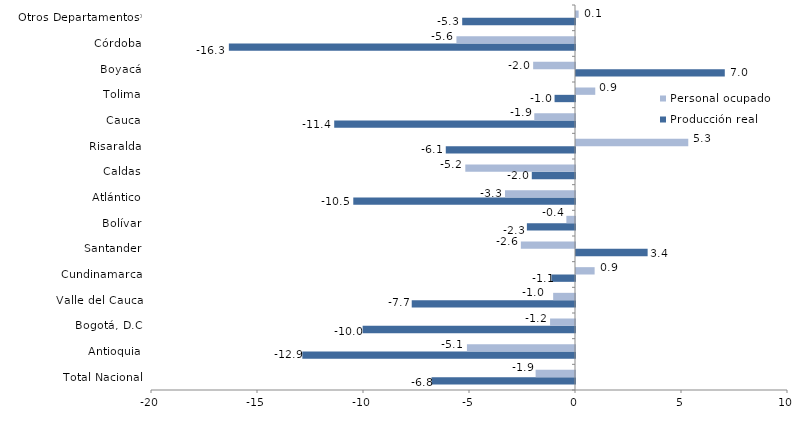
| Category | Producción real | Personal ocupado |
|---|---|---|
| Total Nacional | -6.766 | -1.858 |
| Antioquia | -12.861 | -5.097 |
| Bogotá, D.C | -10.017 | -1.176 |
| Valle del Cauca | -7.701 | -1.03 |
| Cundinamarca | -1.112 | 0.878 |
| Santander | 3.379 | -2.553 |
| Bolívar | -2.269 | -0.407 |
| Atlántico | -10.458 | -3.302 |
| Caldas | -2.038 | -5.174 |
| Risaralda | -6.095 | 5.296 |
| Cauca | -11.358 | -1.92 |
| Tolima | -0.964 | 0.909 |
| Boyacá | 7.019 | -1.974 |
| Córdoba | -16.327 | -5.593 |
| Otros Departamentos* | -5.321 | 0.125 |